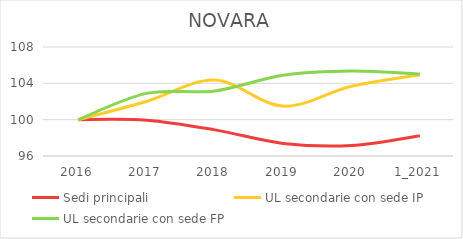
| Category | Sedi principali | UL secondarie con sede IP | UL secondarie con sede FP |
|---|---|---|---|
| 2016 | 100 | 100 | 100 |
| 2017 | 99.941 | 102.007 | 102.895 |
| 2018 | 98.877 | 104.355 | 103.164 |
| 2019 | 97.388 | 101.494 | 104.881 |
| 2020 | 97.153 | 103.672 | 105.352 |
| 1_2021 | 98.224 | 104.953 | 105.015 |